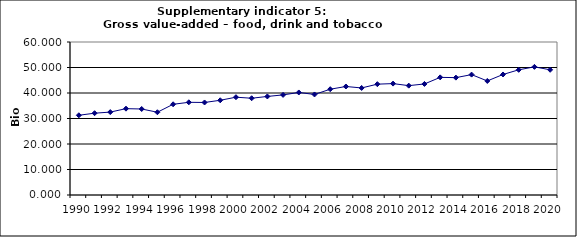
| Category | Gross value-added – food, drink and tobacco industry, Bio Euro (EC95) |
|---|---|
| 1990 | 31.268 |
| 1991 | 32.078 |
| 1992 | 32.518 |
| 1993 | 33.858 |
| 1994 | 33.727 |
| 1995 | 32.452 |
| 1996 | 35.571 |
| 1997 | 36.349 |
| 1998 | 36.285 |
| 1999 | 37.15 |
| 2000 | 38.352 |
| 2001 | 37.944 |
| 2002 | 38.649 |
| 2003 | 39.253 |
| 2004 | 40.211 |
| 2005 | 39.429 |
| 2006 | 41.488 |
| 2007 | 42.549 |
| 2008 | 41.985 |
| 2009 | 43.465 |
| 2010 | 43.685 |
| 2011 | 42.884 |
| 2012 | 43.545 |
| 2013 | 46.129 |
| 2014 | 46.028 |
| 2015 | 47.211 |
| 2016 | 44.727 |
| 2017 | 47.262 |
| 2018 | 49.099 |
| 2019 | 50.248 |
| 2020 | 49.104 |